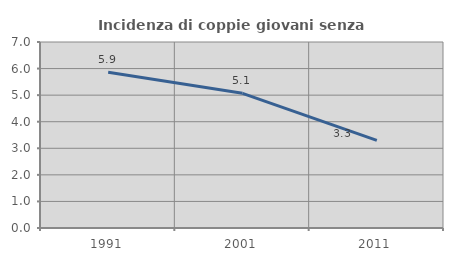
| Category | Incidenza di coppie giovani senza figli |
|---|---|
| 1991.0 | 5.858 |
| 2001.0 | 5.07 |
| 2011.0 | 3.298 |